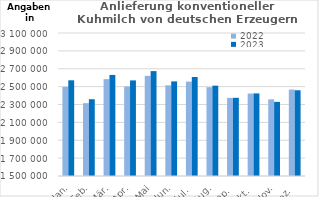
| Category | 2022 | 2023 |
|---|---|---|
| Jan. | 2496735.822 | 2570729.882 |
| Feb. | 2314940.748 | 2359059.742 |
| Mär. | 2583486.009 | 2630869.129 |
| Apr. | 2501605.593 | 2569719.993 |
| Mai | 2620937.152 | 2673701.468 |
| Jun. | 2514408.398 | 2558684.011 |
| Jul. | 2556116.585 | 2607456.281 |
| Aug. | 2493386.732 | 2510801.285 |
| Sep. | 2373998.295 | 2374850.095 |
| Okt. | 2422790.845 | 2424212.752 |
| Nov. | 2357682.346 | 2329397.373 |
| Dez. | 2467339.008 | 2459158.484 |